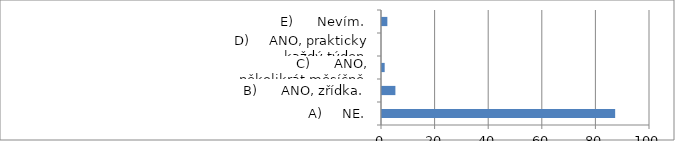
| Category | Series 0 |
|---|---|
| A)     NE. | 87 |
| B)      ANO, zřídka. | 5 |
| C)      ANO, několikrát měsíčně. | 1 |
| D)     ANO, prakticky každý týden. | 0 |
| E)      Nevím. | 2 |